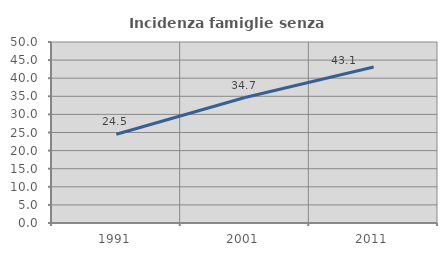
| Category | Incidenza famiglie senza nuclei |
|---|---|
| 1991.0 | 24.507 |
| 2001.0 | 34.667 |
| 2011.0 | 43.086 |